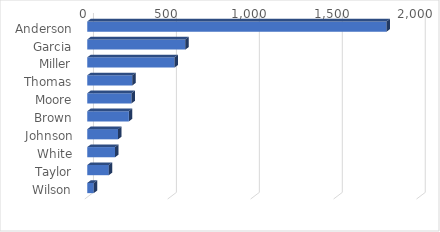
| Category | Total |
|---|---|
| Anderson | 1804.21 |
| Garcia | 591.24 |
| Miller | 526.42 |
| Thomas | 271.54 |
| Moore | 266.89 |
| Brown | 250.93 |
| Johnson | 185.73 |
| White | 167.81 |
| Taylor | 130.1 |
| Wilson | 39.09 |